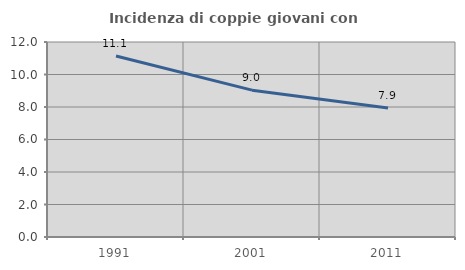
| Category | Incidenza di coppie giovani con figli |
|---|---|
| 1991.0 | 11.141 |
| 2001.0 | 9.036 |
| 2011.0 | 7.941 |